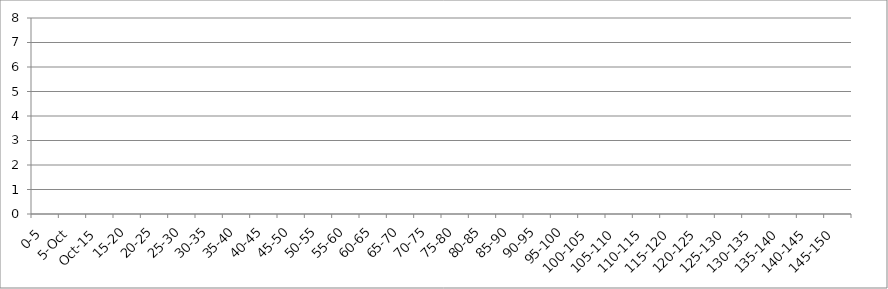
| Category | 12 UNION_ALL | 12 INTERSECTION_ALL | 12 UNION(INTERSECTION_119875_146067,INTERSECTION_119875_241240,INTERSECTION_146067_241240) |
|---|---|---|---|
| 0-5 | 0 | 0 | 0 |
| 5.Oct | 0 | 0 | 0 |
| Oct.15 | 0 | 0 | 0 |
| 15-20 | 0 | 0 | 0 |
| 20-25 | 0 | 0 | 0 |
| 25-30 | 0 | 0 | 0 |
| 30-35 | 0 | 0 | 0 |
| 35-40 | 0 | 0 | 0 |
| 40-45 | 0 | 0 | 0 |
| 45-50 | 0 | 0 | 0 |
| 50-55 | 0 | 0 | 0 |
| 55-60 | 0 | 0 | 0 |
| 60-65 | 0 | 0 | 0 |
| 65-70 | 0 | 0 | 0 |
| 70-75 | 0 | 0 | 0 |
| 75-80 | 0 | 0 | 0 |
| 80-85 | 0 | 0 | 0 |
| 85-90 | 0 | 0 | 0 |
| 90-95 | 0 | 0 | 0 |
| 95-100 | 0 | 0 | 0 |
| 100-105 | 0 | 0 | 0 |
| 105-110 | 0 | 0 | 0 |
| 110-115 | 0 | 0 | 0 |
| 115-120 | 0 | 0 | 0 |
| 120-125 | 0 | 0 | 0 |
| 125-130 | 0 | 0 | 0 |
| 130-135 | 0 | 0 | 0 |
| 135-140 | 0 | 0 | 0 |
| 140-145 | 0 | 0 | 0 |
| 145-150 | 0 | 0 | 0 |